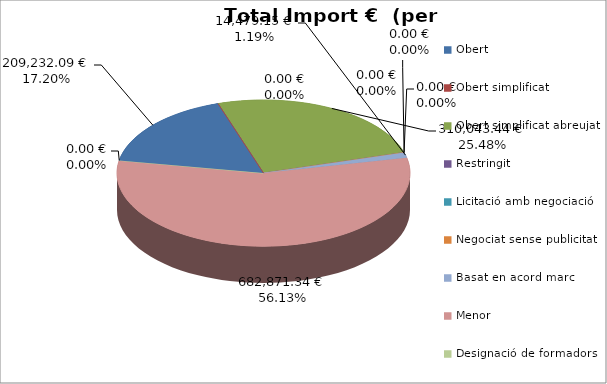
| Category | Total preu              (amb iva) |
|---|---|
| Obert | 209232.09 |
| Obert simplificat | 0 |
| Obert simplificat abreujat | 310043.44 |
| Restringit | 0 |
| Licitació amb negociació | 0 |
| Negociat sense publicitat | 0 |
| Basat en acord marc | 14479.15 |
| Menor | 682871.34 |
| Designació de formadors | 0 |